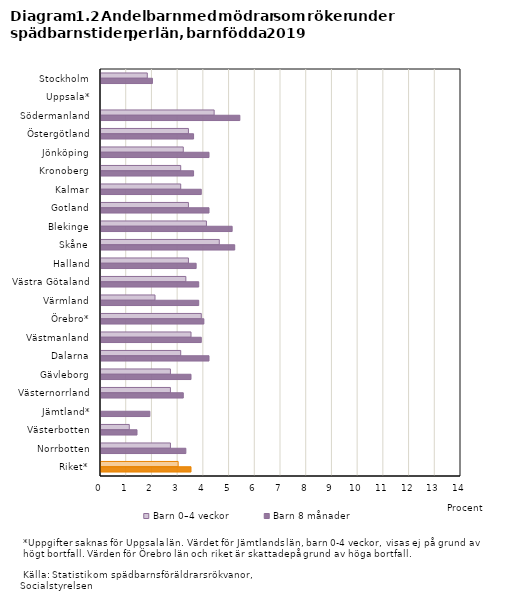
| Category | Barn 0–4 veckor | Barn 8 månader |
|---|---|---|
| Stockholm | 1.8 | 2 |
| Uppsala* | 0 | 0 |
| Södermanland | 4.4 | 5.4 |
| Östergötland | 3.4 | 3.6 |
| Jönköping | 3.2 | 4.2 |
| Kronoberg | 3.1 | 3.6 |
| Kalmar | 3.1 | 3.9 |
| Gotland | 3.4 | 4.2 |
| Blekinge | 4.1 | 5.1 |
| Skåne | 4.6 | 5.2 |
| Halland | 3.4 | 3.7 |
| Västra Götaland | 3.3 | 3.8 |
| Värmland | 2.1 | 3.8 |
| Örebro* | 3.9 | 4 |
| Västmanland | 3.5 | 3.9 |
| Dalarna | 3.1 | 4.2 |
| Gävleborg | 2.7 | 3.5 |
| Västernorrland | 2.7 | 3.2 |
| Jämtland* | 0 | 1.9 |
| Västerbotten | 1.1 | 1.4 |
| Norrbotten | 2.7 | 3.3 |
| Riket* | 3 | 3.5 |